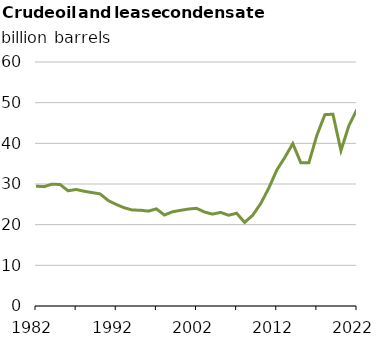
| Category | Crude oil and lease condensate proved reserves (billion barrels) |
|---|---|
| 1982.0 | 29.459 |
| 1983.0 | 29.348 |
| 1984.0 | 29.968 |
| 1985.0 | 29.869 |
| 1986.0 | 28.325 |
| 1987.0 | 28.658 |
| 1988.0 | 28.214 |
| 1989.0 | 27.89 |
| 1990.0 | 27.556 |
| 1991.0 | 25.926 |
| 1992.0 | 24.971 |
| 1993.0 | 24.149 |
| 1994.0 | 23.604 |
| 1995.0 | 23.548 |
| 1996.0 | 23.324 |
| 1997.0 | 23.887 |
| 1998.0 | 22.37 |
| 1999.0 | 23.168 |
| 2000.0 | 23.517 |
| 2001.0 | 23.844 |
| 2002.0 | 24.023 |
| 2003.0 | 23.106 |
| 2004.0 | 22.592 |
| 2005.0 | 23.019 |
| 2006.0 | 22.311 |
| 2007.0 | 22.812 |
| 2008.0 | 20.554 |
| 2009.0 | 22.315 |
| 2010.0 | 25.181 |
| 2011.0 | 28.95 |
| 2012.0 | 33.403 |
| 2013.0 | 36.52 |
| 2014.0 | 39.933 |
| 2015.0 | 35.23 |
| 2016.0 | 35.213 |
| 2017.0 | 41.99 |
| 2018.0 | 47.053 |
| 2019.0 | 47.172 |
| 2020.0 | 38.212 |
| 2021.0 | 44.418 |
| 2022.0 | 48.321 |